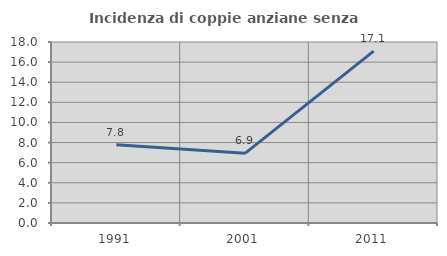
| Category | Incidenza di coppie anziane senza figli  |
|---|---|
| 1991.0 | 7.778 |
| 2001.0 | 6.931 |
| 2011.0 | 17.094 |